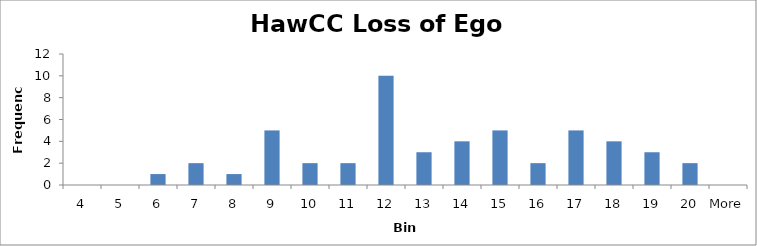
| Category | Frequency |
|---|---|
| 4 | 0 |
| 5 | 0 |
| 6 | 1 |
| 7 | 2 |
| 8 | 1 |
| 9 | 5 |
| 10 | 2 |
| 11 | 2 |
| 12 | 10 |
| 13 | 3 |
| 14 | 4 |
| 15 | 5 |
| 16 | 2 |
| 17 | 5 |
| 18 | 4 |
| 19 | 3 |
| 20 | 2 |
| More | 0 |